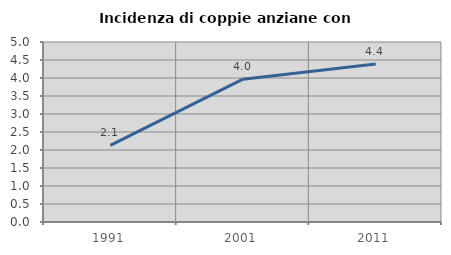
| Category | Incidenza di coppie anziane con figli |
|---|---|
| 1991.0 | 2.128 |
| 2001.0 | 3.968 |
| 2011.0 | 4.386 |